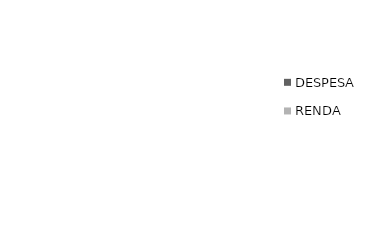
| Category | DESPESA | RENDA |
|---|---|---|
| 0 | 0 | 0 |